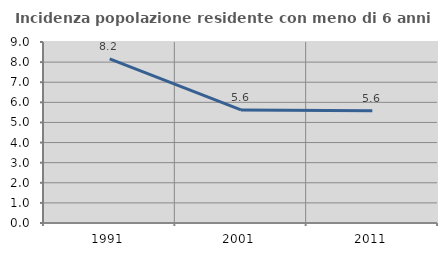
| Category | Incidenza popolazione residente con meno di 6 anni |
|---|---|
| 1991.0 | 8.157 |
| 2001.0 | 5.62 |
| 2011.0 | 5.579 |